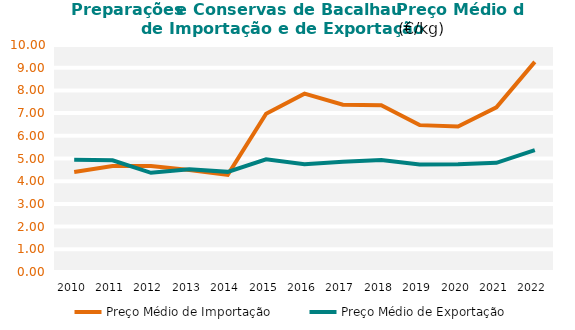
| Category | Preço Médio de Importação | Preço Médio de Exportação |
|---|---|---|
| 2010.0 | 4.409 | 4.947 |
| 2011.0 | 4.67 | 4.923 |
| 2012.0 | 4.672 | 4.369 |
| 2013.0 | 4.49 | 4.528 |
| 2014.0 | 4.282 | 4.411 |
| 2015.0 | 6.972 | 4.967 |
| 2016.0 | 7.858 | 4.749 |
| 2017.0 | 7.371 | 4.854 |
| 2018.0 | 7.348 | 4.933 |
| 2019.0 | 6.47 | 4.74 |
| 2020.0 | 6.406 | 4.745 |
| 2021.0 | 7.255 | 4.807 |
| 2022.0 | 9.255 | 5.372 |